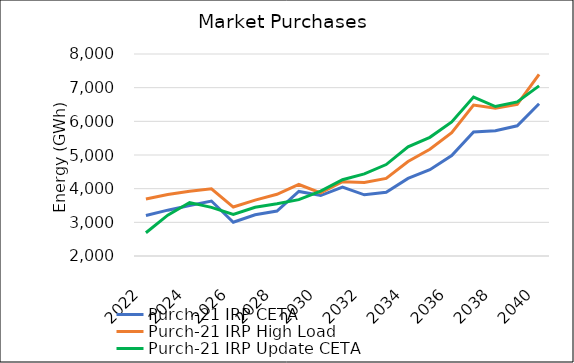
| Category | Purch-21 IRP CETA | Purch-21 IRP High Load | Purch-21 IRP Update CETA |
|---|---|---|---|
| 2022.0 | 3201.24 | 3693.7 | 2690.64 |
| 2023.0 | 3361.33 | 3825.01 | 3212.992 |
| 2024.0 | 3500.57 | 3922.13 | 3588.095 |
| 2025.0 | 3633.53 | 3994.79 | 3444.895 |
| 2026.0 | 3001.7 | 3454.61 | 3236.476 |
| 2027.0 | 3223.85 | 3660.66 | 3448.859 |
| 2028.0 | 3335.5 | 3832.24 | 3551.768 |
| 2029.0 | 3918.69 | 4124.31 | 3675.265 |
| 2030.0 | 3795.09 | 3872.03 | 3926.76 |
| 2031.0 | 4049.96 | 4207.96 | 4266.381 |
| 2032.0 | 3818.09 | 4183.84 | 4440.504 |
| 2033.0 | 3895.64 | 4305.84 | 4715.603 |
| 2034.0 | 4305.95 | 4804.92 | 5244.919 |
| 2035.0 | 4565.24 | 5171.13 | 5524.79 |
| 2036.0 | 4983.61 | 5662.99 | 5981.542 |
| 2037.0 | 5682.68 | 6481.91 | 6721.502 |
| 2038.0 | 5720.49 | 6390.51 | 6440.328 |
| 2039.0 | 5868.09 | 6504.74 | 6578.152 |
| 2040.0 | 6520.89 | 7397.97 | 7054.364 |